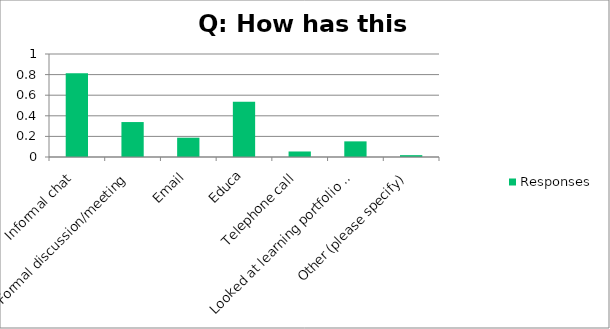
| Category | Responses |
|---|---|
| Informal chat | 0.812 |
| Formal discussion/meeting | 0.339 |
| Email | 0.188 |
| Educa | 0.536 |
| Telephone call | 0.054 |
| Looked at learning portfolio / daily records | 0.152 |
| Other (please specify) | 0.018 |